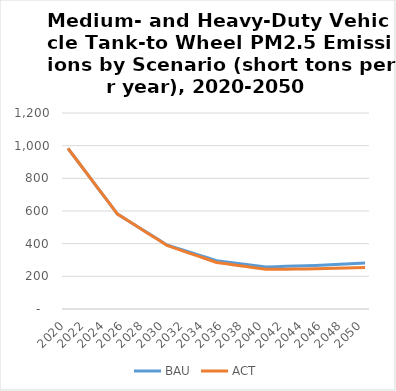
| Category | BAU | ACT |
|---|---|---|
| 2020.0 | 984 | 984 |
| 2021.0 | 903 | 903 |
| 2022.0 | 823 | 823 |
| 2023.0 | 742 | 742 |
| 2024.0 | 662 | 662 |
| 2025.0 | 581 | 581 |
| 2026.0 | 543 | 543 |
| 2027.0 | 505 | 505 |
| 2028.0 | 468 | 466 |
| 2029.0 | 430 | 428 |
| 2030.0 | 392 | 389 |
| 2031.0 | 373 | 368 |
| 2032.0 | 354 | 347 |
| 2033.0 | 334 | 327 |
| 2034.0 | 315 | 306 |
| 2035.0 | 296 | 285 |
| 2036.0 | 288 | 277 |
| 2037.0 | 280 | 268 |
| 2038.0 | 273 | 260 |
| 2039.0 | 265 | 251 |
| 2040.0 | 257 | 243 |
| 2041.0 | 259 | 244 |
| 2042.0 | 261 | 244 |
| 2043.0 | 263 | 245 |
| 2044.0 | 265 | 245 |
| 2045.0 | 267 | 246 |
| 2046.0 | 270 | 248 |
| 2047.0 | 273 | 249 |
| 2048.0 | 275 | 251 |
| 2049.0 | 278 | 252 |
| 2050.0 | 281 | 254 |